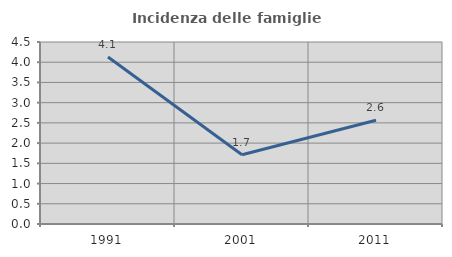
| Category | Incidenza delle famiglie numerose |
|---|---|
| 1991.0 | 4.129 |
| 2001.0 | 1.711 |
| 2011.0 | 2.564 |